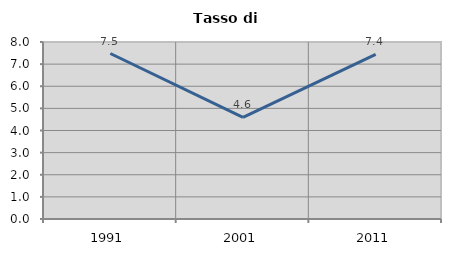
| Category | Tasso di disoccupazione   |
|---|---|
| 1991.0 | 7.479 |
| 2001.0 | 4.595 |
| 2011.0 | 7.44 |